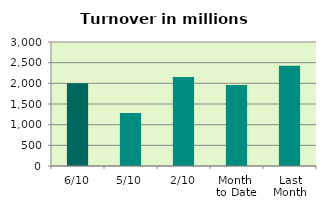
| Category | Series 0 |
|---|---|
| 6/10 | 2000.714 |
| 5/10 | 1282.954 |
| 2/10 | 2155.667 |
| Month 
to Date | 1959.977 |
| Last
Month | 2424.403 |